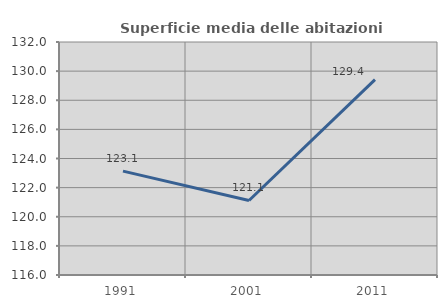
| Category | Superficie media delle abitazioni occupate |
|---|---|
| 1991.0 | 123.132 |
| 2001.0 | 121.117 |
| 2011.0 | 129.418 |